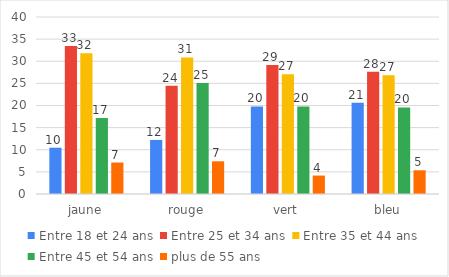
| Category | Entre 18 et 24 ans | Entre 25 et 34 ans | Entre 35 et 44 ans | Entre 45 et 54 ans | plus de 55 ans |
|---|---|---|---|---|---|
| jaune | 10.46 | 33.473 | 31.799 | 17.155 | 7.113 |
| rouge | 12.219 | 24.437 | 30.868 | 25.08 | 7.395 |
| vert | 19.792 | 29.167 | 27.083 | 19.792 | 4.167 |
| bleu | 20.643 | 27.614 | 26.81 | 19.571 | 5.362 |